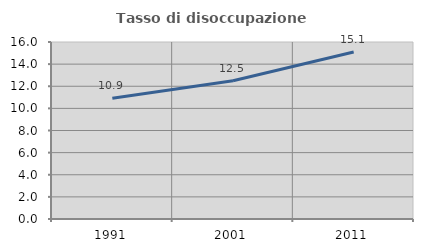
| Category | Tasso di disoccupazione giovanile  |
|---|---|
| 1991.0 | 10.924 |
| 2001.0 | 12.5 |
| 2011.0 | 15.094 |